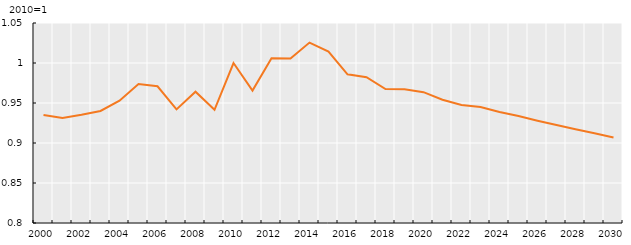
| Category | Series 1 |
|---|---|
| 2000.0 | 0.935 |
| 2001.0 | 0.931 |
| 2002.0 | 0.935 |
| 2003.0 | 0.94 |
| 2004.0 | 0.953 |
| 2005.0 | 0.974 |
| 2006.0 | 0.971 |
| 2007.0 | 0.942 |
| 2008.0 | 0.964 |
| 2009.0 | 0.942 |
| 2010.0 | 1 |
| 2011.0 | 0.965 |
| 2012.0 | 1.006 |
| 2013.0 | 1.006 |
| 2014.0 | 1.026 |
| 2015.0 | 1.014 |
| 2016.0 | 0.986 |
| 2017.0 | 0.982 |
| 2018.0 | 0.967 |
| 2019.0 | 0.967 |
| 2020.0 | 0.964 |
| 2021.0 | 0.954 |
| 2022.0 | 0.948 |
| 2023.0 | 0.945 |
| 2024.0 | 0.939 |
| 2025.0 | 0.934 |
| 2026.0 | 0.928 |
| 2027.0 | 0.923 |
| 2028.0 | 0.917 |
| 2029.0 | 0.912 |
| 2030.0 | 0.907 |